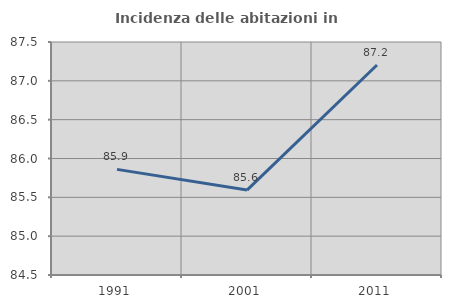
| Category | Incidenza delle abitazioni in proprietà  |
|---|---|
| 1991.0 | 85.86 |
| 2001.0 | 85.593 |
| 2011.0 | 87.204 |